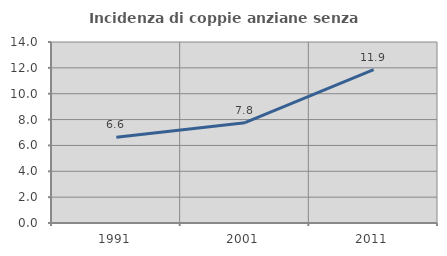
| Category | Incidenza di coppie anziane senza figli  |
|---|---|
| 1991.0 | 6.633 |
| 2001.0 | 7.761 |
| 2011.0 | 11.859 |